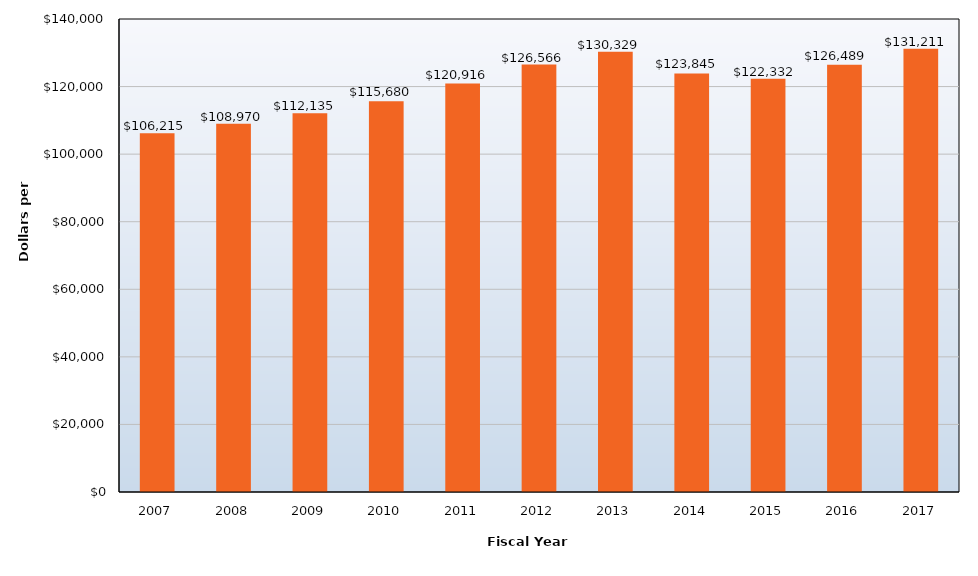
| Category | Total Revenue |
|---|---|
| 2007.0 | 106215 |
| 2008.0 | 108970 |
| 2009.0 | 112135 |
| 2010.0 | 115680 |
| 2011.0 | 120916 |
| 2012.0 | 126566 |
| 2013.0 | 130329 |
| 2014.0 | 123845 |
| 2015.0 | 122332 |
| 2016.0 | 126489 |
| 2017.0 | 131211 |